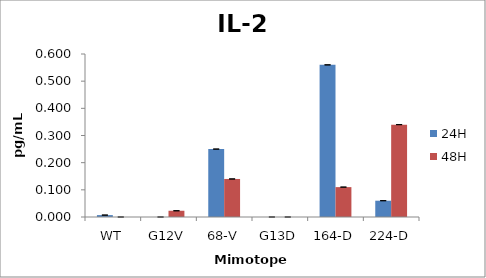
| Category | 24H | 48H |
|---|---|---|
| WT | 0.007 | 0 |
| G12V | 0 | 0.023 |
| 68-V | 0.25 | 0.14 |
| G13D | 0 | 0 |
| 164-D | 0.56 | 0.11 |
| 224-D | 0.06 | 0.34 |